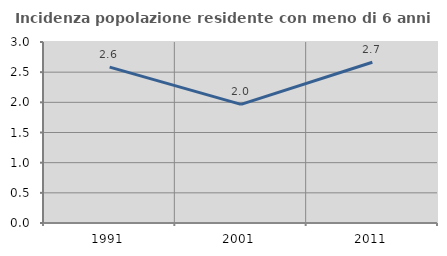
| Category | Incidenza popolazione residente con meno di 6 anni |
|---|---|
| 1991.0 | 2.584 |
| 2001.0 | 1.966 |
| 2011.0 | 2.665 |